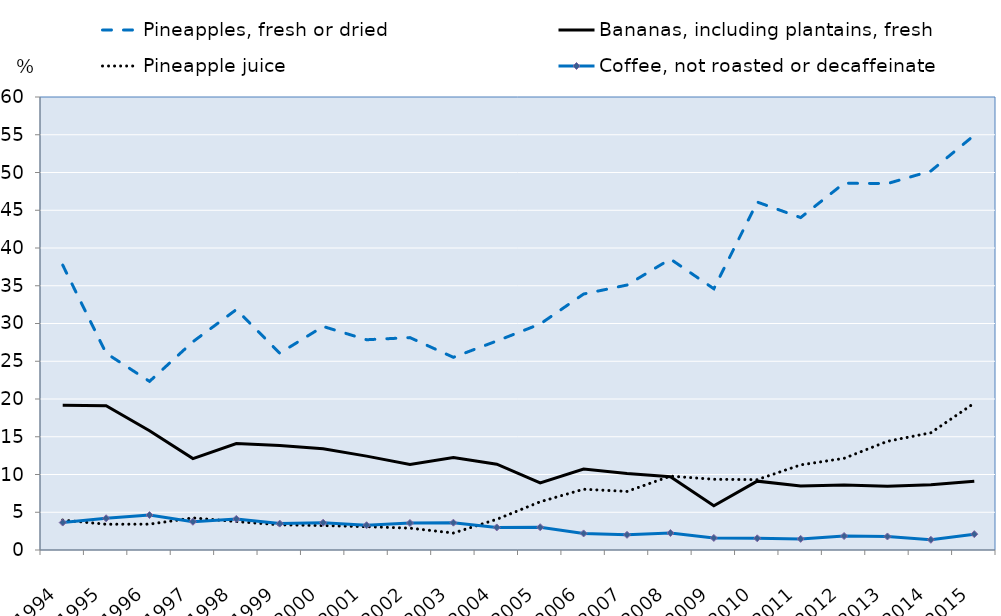
| Category | Pineapples, fresh or dried | Bananas, including plantains, fresh | Pineapple juice | Coffee, not roasted or decaffeinate |
|---|---|---|---|---|
| 1994 | 37.735 | 19.165 | 3.961 | 3.635 |
| 1995 | 26.063 | 19.106 | 3.41 | 4.2 |
| 1996 | 22.332 | 15.803 | 3.424 | 4.628 |
| 1997 | 27.587 | 12.113 | 4.249 | 3.741 |
| 1998 | 31.846 | 14.11 | 3.763 | 4.118 |
| 1999 | 26.072 | 13.838 | 3.337 | 3.495 |
| 2000 | 29.608 | 13.398 | 3.234 | 3.618 |
| 2001 | 27.849 | 12.431 | 3.091 | 3.283 |
| 2002 | 28.131 | 11.335 | 2.893 | 3.576 |
| 2003 | 25.522 | 12.236 | 2.248 | 3.622 |
| 2004 | 27.684 | 11.365 | 4.063 | 2.988 |
| 2005 | 29.936 | 8.89 | 6.388 | 3.016 |
| 2006 | 33.903 | 10.727 | 8.046 | 2.197 |
| 2007 | 35.093 | 10.144 | 7.761 | 2.012 |
| 2008 | 38.536 | 9.708 | 9.783 | 2.25 |
| 2009 | 34.599 | 5.867 | 9.366 | 1.598 |
| 2010 | 46.085 | 9.121 | 9.319 | 1.55 |
| 2011 | 44.03 | 8.486 | 11.271 | 1.471 |
| 2012 | 48.584 | 8.611 | 12.142 | 1.85 |
| 2013 | 48.534 | 8.455 | 14.399 | 1.79 |
| 2014 | 50.199 | 8.634 | 15.53 | 1.352 |
| 2015 | 54.937 | 9.105 | 19.454 | 2.1 |